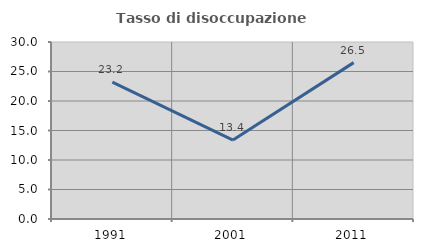
| Category | Tasso di disoccupazione giovanile  |
|---|---|
| 1991.0 | 23.214 |
| 2001.0 | 13.386 |
| 2011.0 | 26.506 |